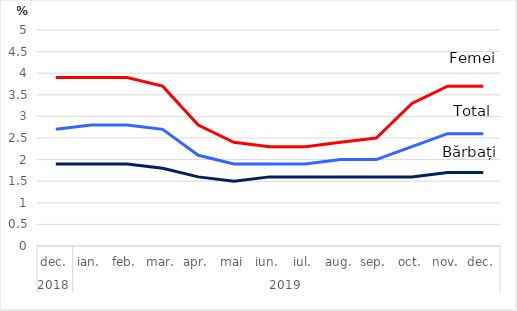
| Category | Total judeţ | Bărbaţi | Femei |
|---|---|---|---|
| 0 | 2.7 | 1.9 | 3.9 |
| 1 | 2.8 | 1.9 | 3.9 |
| 2 | 2.8 | 1.9 | 3.9 |
| 3 | 2.7 | 1.8 | 3.7 |
| 4 | 2.1 | 1.6 | 2.8 |
| 5 | 1.9 | 1.5 | 2.4 |
| 6 | 1.9 | 1.6 | 2.3 |
| 7 | 1.9 | 1.6 | 2.3 |
| 8 | 2 | 1.6 | 2.4 |
| 9 | 2 | 1.6 | 2.5 |
| 10 | 2.3 | 1.6 | 3.3 |
| 11 | 2.6 | 1.7 | 3.7 |
| 12 | 2.6 | 1.7 | 3.7 |